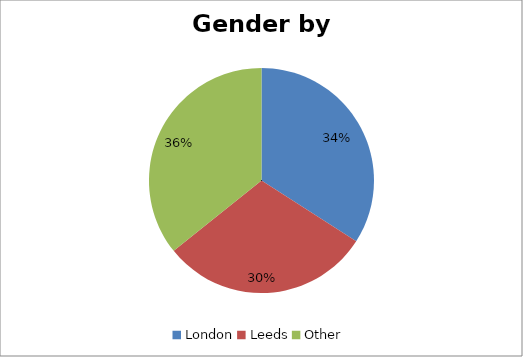
| Category | Female Total % | Male Total % |
|---|---|---|
| London | 0.61 | 0.39 |
| Leeds | 0.54 | 0.46 |
| Other | 0.64 | 0.36 |